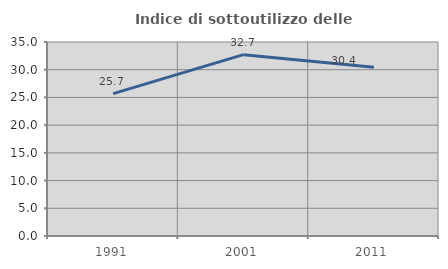
| Category | Indice di sottoutilizzo delle abitazioni  |
|---|---|
| 1991.0 | 25.696 |
| 2001.0 | 32.714 |
| 2011.0 | 30.445 |